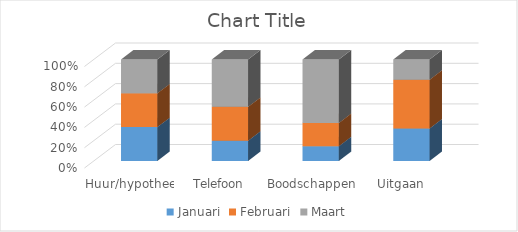
| Category | Januari | Februari | Maart |
|---|---|---|---|
| Huur/hypotheek | 12 | 12 | 12 |
| Telefoon | 6 | 10 | 14 |
| Boodschappen | 7 | 11 | 30 |
| Uitgaan | 8 | 12 | 5 |